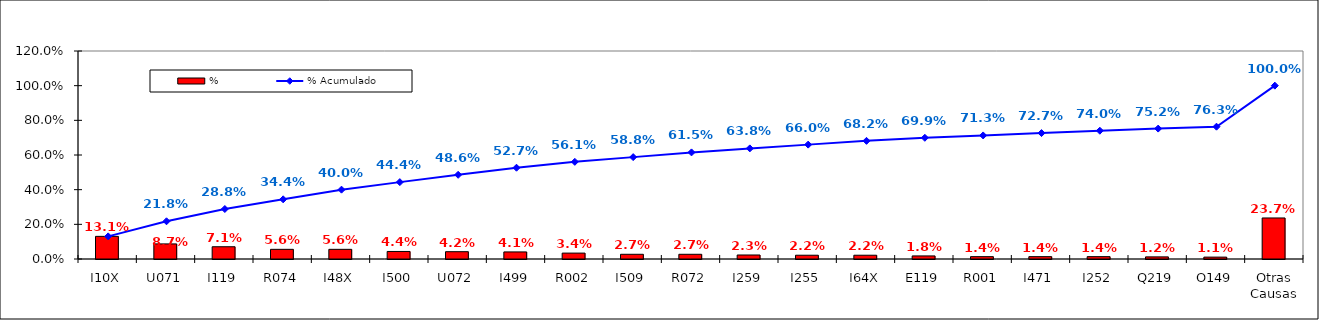
| Category | % |
|---|---|
| I10X | 0.131 |
| U071 | 0.087 |
| I119 | 0.071 |
| R074 | 0.056 |
| I48X | 0.056 |
| I500 | 0.044 |
| U072 | 0.042 |
| I499 | 0.041 |
| R002 | 0.034 |
| I509 | 0.027 |
| R072 | 0.027 |
| I259 | 0.023 |
| I255 | 0.022 |
| I64X | 0.022 |
| E119 | 0.018 |
| R001 | 0.014 |
| I471 | 0.014 |
| I252 | 0.014 |
| Q219 | 0.012 |
| O149 | 0.011 |
| Otras Causas | 0.237 |